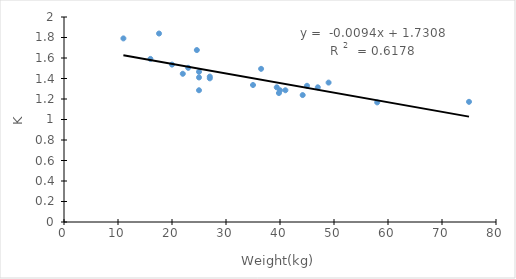
| Category | Series 0 |
|---|---|
| 11.0 | 1.791 |
| 16.0 | 1.591 |
| 17.6 | 1.839 |
| 20.0 | 1.535 |
| 22.0 | 1.446 |
| 23.0 | 1.504 |
| 24.6 | 1.677 |
| 25.0 | 1.285 |
| 25.0 | 1.465 |
| 25.0 | 1.41 |
| 27.0 | 1.419 |
| 27.0 | 1.401 |
| 35.0 | 1.337 |
| 36.5 | 1.494 |
| 39.4 | 1.314 |
| 39.8 | 1.258 |
| 40.0 | 1.285 |
| 41.0 | 1.285 |
| 44.2 | 1.238 |
| 45.0 | 1.329 |
| 47.0 | 1.314 |
| 49.0 | 1.36 |
| 58.0 | 1.167 |
| 75.0 | 1.172 |